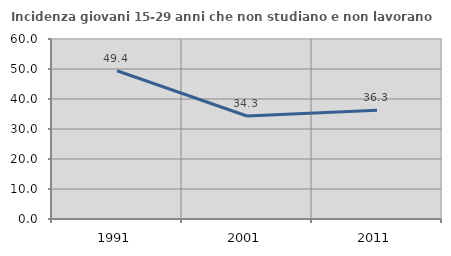
| Category | Incidenza giovani 15-29 anni che non studiano e non lavorano  |
|---|---|
| 1991.0 | 49.421 |
| 2001.0 | 34.343 |
| 2011.0 | 36.25 |